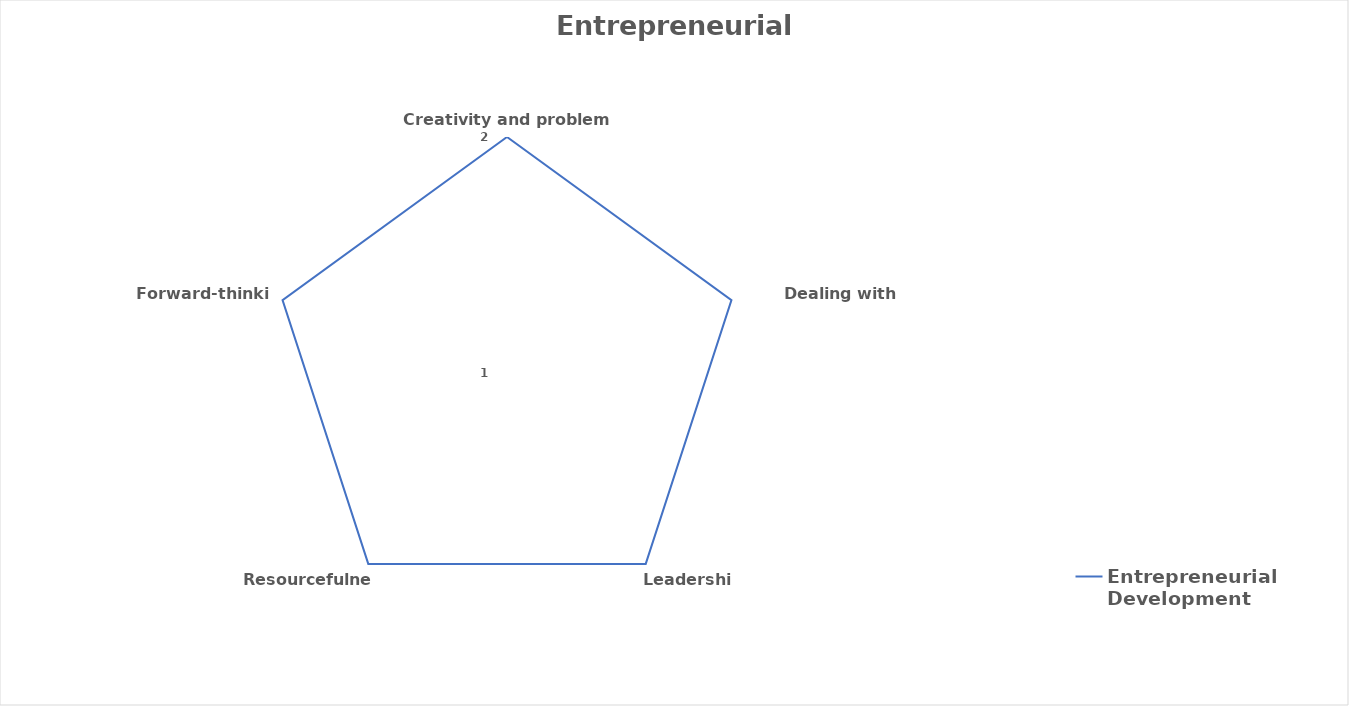
| Category | Entrepreneurial Development |
|---|---|
| Creativity and problem solving | 0 |
| Dealing with uncertainty | 0 |
| Leadership | 0 |
| Resourcefulness | 0 |
| Forward-thinking | 0 |